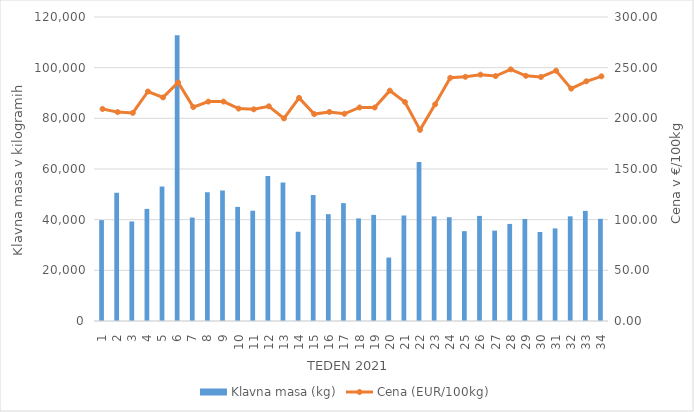
| Category | Klavna masa (kg) |
|---|---|
| 1.0 | 39814 |
| 2.0 | 50603 |
| 3.0 | 39295 |
| 4.0 | 44250 |
| 5.0 | 53061 |
| 6.0 | 112816 |
| 7.0 | 40829 |
| 8.0 | 50775 |
| 9.0 | 51535 |
| 10.0 | 45040 |
| 11.0 | 43536 |
| 12.0 | 57246 |
| 13.0 | 54680 |
| 14.0 | 35237 |
| 15.0 | 49721 |
| 16.0 | 42177 |
| 17.0 | 46525 |
| 18.0 | 40491 |
| 19.0 | 41888 |
| 20.0 | 25048 |
| 21.0 | 41651 |
| 22.0 | 62774 |
| 23.0 | 41297 |
| 24.0 | 40971 |
| 25.0 | 35465 |
| 26.0 | 41489 |
| 27.0 | 35675 |
| 28.0 | 38316 |
| 29.0 | 40265 |
| 30.0 | 35146 |
| 31.0 | 36548 |
| 32.0 | 41314 |
| 33.0 | 43471 |
| 34.0 | 40333 |